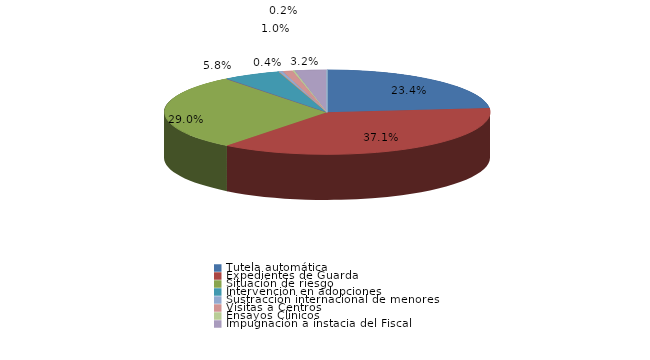
| Category | Series 0 |
|---|---|
| Tutela automática | 118 |
| Expedientes de Guarda | 187 |
| Situación de riesgo | 146 |
| Intervención en acogimientos | 0 |
| Intervención en adopciones | 29 |
| Defensa de los derechos fundamentales | 0 |
| Sustracción internacional de menores | 2 |
| Visitas a Centros | 5 |
| Ensayos Clínicos | 1 |
| Impugnación a instacia del Fiscal | 16 |
| Impugnación a instancia de particulares | 0 |